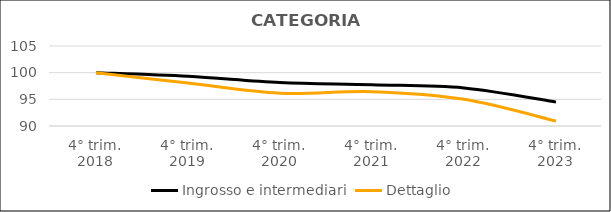
| Category | Ingrosso e intermediari | Dettaglio  |
|---|---|---|
| 4° trim.
2018 | 100 | 100 |
| 4° trim.
2019 | 99.318 | 98.045 |
| 4° trim.
2020 | 98.14 | 96.146 |
| 4° trim.
2021 | 97.731 | 96.443 |
| 4° trim.
2022 | 97.146 | 95.007 |
| 4° trim.
2023 | 94.477 | 90.94 |